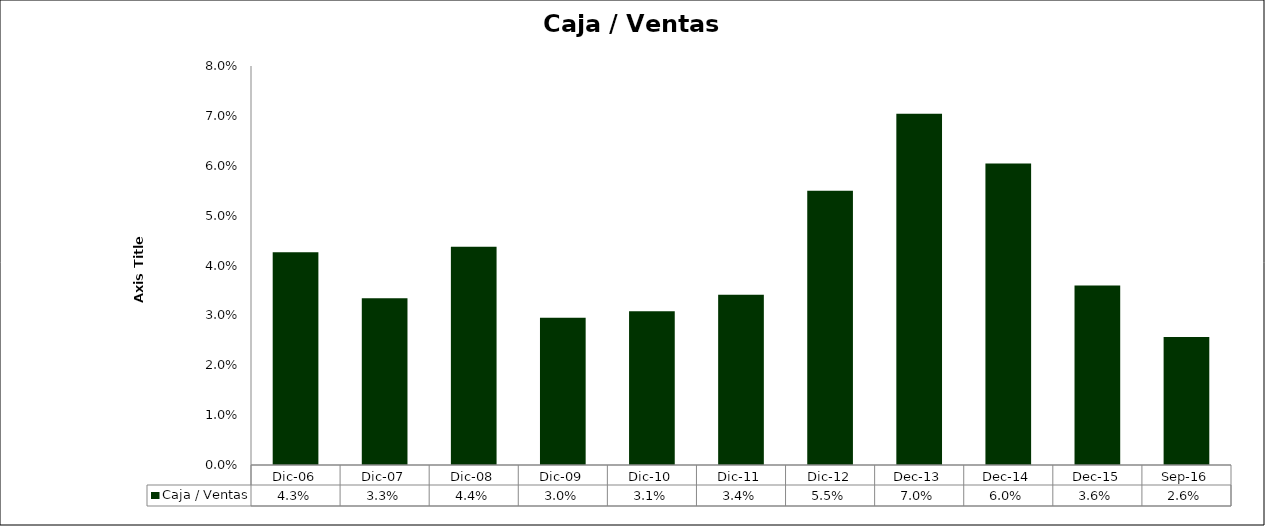
| Category | Caja / Ventas |
|---|---|
| Dic-06 | 0.043 |
| Dic-07 | 0.033 |
| Dic-08 | 0.044 |
| Dic-09 | 0.03 |
| Dic-10 | 0.031 |
| Dic-11 | 0.034 |
| Dic-12 | 0.055 |
| dic-13 | 0.07 |
| dic-14 | 0.06 |
| dic-15 | 0.036 |
| Sep-16 | 0.026 |